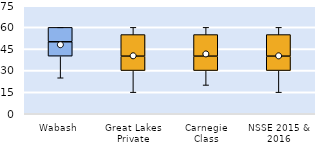
| Category | 25th | 50th | 75th |
|---|---|---|---|
| Wabash | 40 | 10 | 10 |
| Great Lakes Private | 30 | 10 | 15 |
| Carnegie Class | 30 | 10 | 15 |
| NSSE 2015 & 2016 | 30 | 10 | 15 |